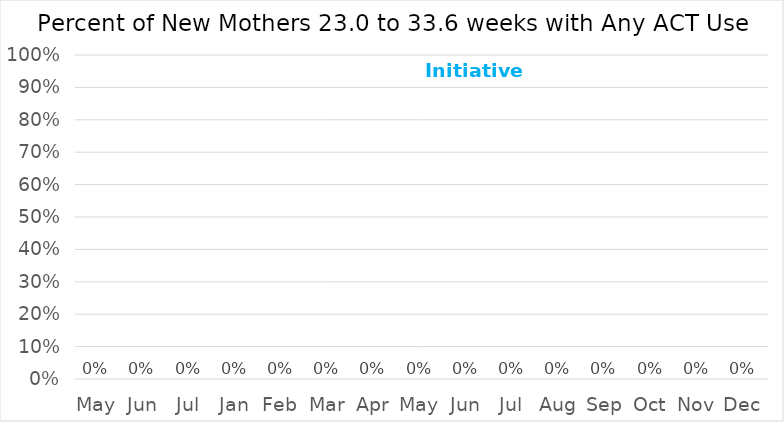
| Category | Any ACT Use |
|---|---|
| May | 0 |
| Jun | 0 |
| Jul | 0 |
| Jan | 0 |
| Feb | 0 |
| Mar | 0 |
| Apr | 0 |
| May | 0 |
| Jun | 0 |
| Jul | 0 |
| Aug | 0 |
| Sep | 0 |
| Oct | 0 |
| Nov | 0 |
| Dec | 0 |